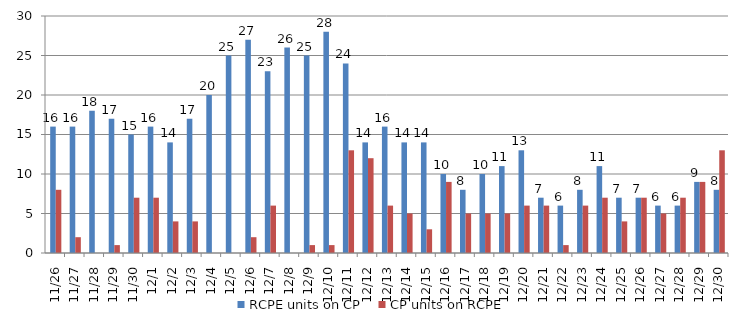
| Category | RCPE units on CP | CP units on RCPE |
|---|---|---|
| 2014-11-26 | 16 | 8 |
| 2014-11-27 | 16 | 2 |
| 2014-11-28 | 18 | 0 |
| 2014-11-29 | 17 | 1 |
| 2014-11-30 | 15 | 7 |
| 2014-12-01 | 16 | 7 |
| 2014-12-02 | 14 | 4 |
| 2014-12-03 | 17 | 4 |
| 2014-12-04 | 20 | 0 |
| 2014-12-05 | 25 | 0 |
| 2014-12-06 | 27 | 2 |
| 2014-12-07 | 23 | 6 |
| 2014-12-08 | 26 | 0 |
| 2014-12-09 | 25 | 1 |
| 2014-12-10 | 28 | 1 |
| 2014-12-11 | 24 | 13 |
| 2014-12-12 | 14 | 12 |
| 2014-12-13 | 16 | 6 |
| 2014-12-14 | 14 | 5 |
| 2014-12-15 | 14 | 3 |
| 2014-12-16 | 10 | 9 |
| 2014-12-17 | 8 | 5 |
| 2014-12-18 | 10 | 5 |
| 2014-12-19 | 11 | 5 |
| 2014-12-20 | 13 | 6 |
| 2014-12-21 | 7 | 6 |
| 2014-12-22 | 6 | 1 |
| 2014-12-23 | 8 | 6 |
| 2014-12-24 | 11 | 7 |
| 2014-12-25 | 7 | 4 |
| 2014-12-26 | 7 | 7 |
| 2014-12-27 | 6 | 5 |
| 2014-12-28 | 6 | 7 |
| 2014-12-29 | 9 | 9 |
| 2014-12-30 | 8 | 13 |